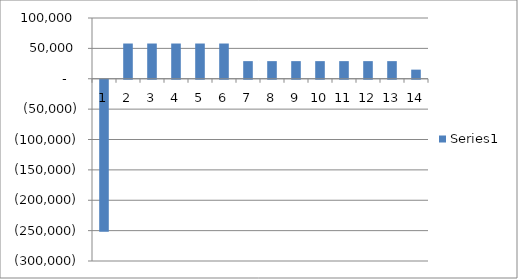
| Category | Series 0 |
|---|---|
| 0 | -250000 |
| 1 | 58000 |
| 2 | 58000 |
| 3 | 58000 |
| 4 | 58000 |
| 5 | 58000 |
| 6 | 29000 |
| 7 | 29000 |
| 8 | 29000 |
| 9 | 29000 |
| 10 | 29000 |
| 11 | 29000 |
| 12 | 29000 |
| 13 | 15000 |